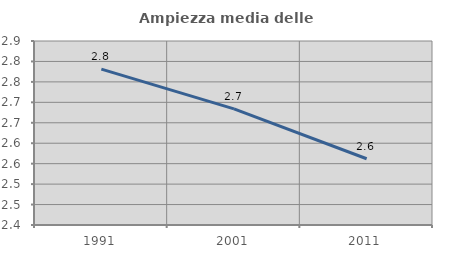
| Category | Ampiezza media delle famiglie |
|---|---|
| 1991.0 | 2.781 |
| 2001.0 | 2.684 |
| 2011.0 | 2.562 |